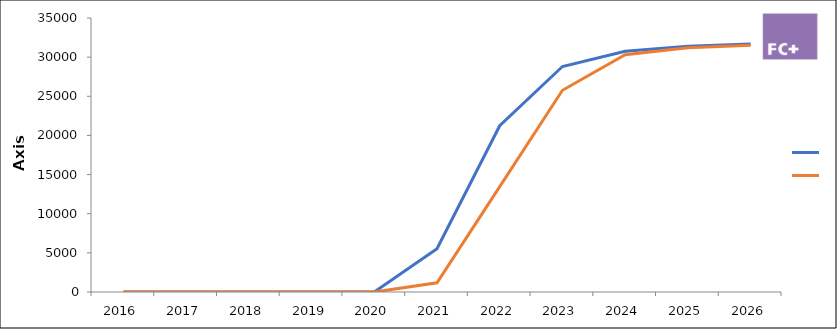
| Category | CVC | CVC+tropifexor |
|---|---|---|
| 2016 | 0 | 0 |
| 2017 | 0 | 0 |
| 2018 | 0 | 0 |
| 2019 | 0 | 0 |
| 2020 | 0 | 0 |
| 2021 | 5529.791 | 1168.593 |
| 2022 | 21234.628 | 13468.894 |
| 2023 | 28803.014 | 25769.426 |
| 2024 | 30757.924 | 30298.4 |
| 2025 | 31379.337 | 31200.472 |
| 2026 | 31693.13 | 31512.477 |